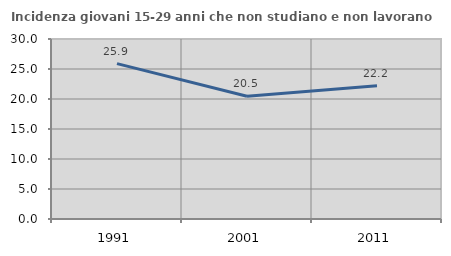
| Category | Incidenza giovani 15-29 anni che non studiano e non lavorano  |
|---|---|
| 1991.0 | 25.893 |
| 2001.0 | 20.455 |
| 2011.0 | 22.222 |